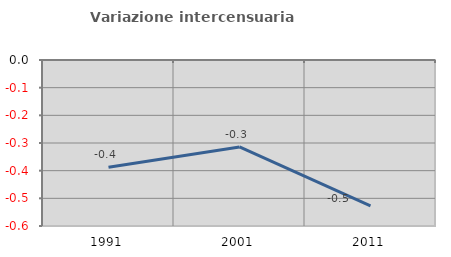
| Category | Variazione intercensuaria annua |
|---|---|
| 1991.0 | -0.387 |
| 2001.0 | -0.314 |
| 2011.0 | -0.527 |